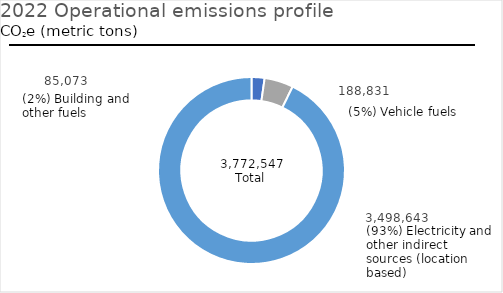
| Category | Series 0 |
|---|---|
| Building and other fuels | 85073.424 |
| Vehicle fuels | 188830.72 |
| Electricity and other indirect sources (Location Based) | 3498643.139 |